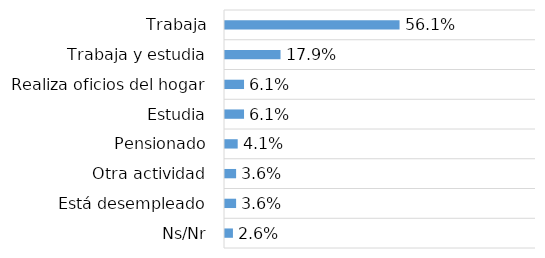
| Category | Series 0 |
|---|---|
| Ns/Nr | 0.026 |
| Está desempleado | 0.036 |
| Otra actividad | 0.036 |
| Pensionado | 0.041 |
| Estudia | 0.061 |
| Realiza oficios del hogar | 0.061 |
| Trabaja y estudia | 0.179 |
| Trabaja | 0.561 |